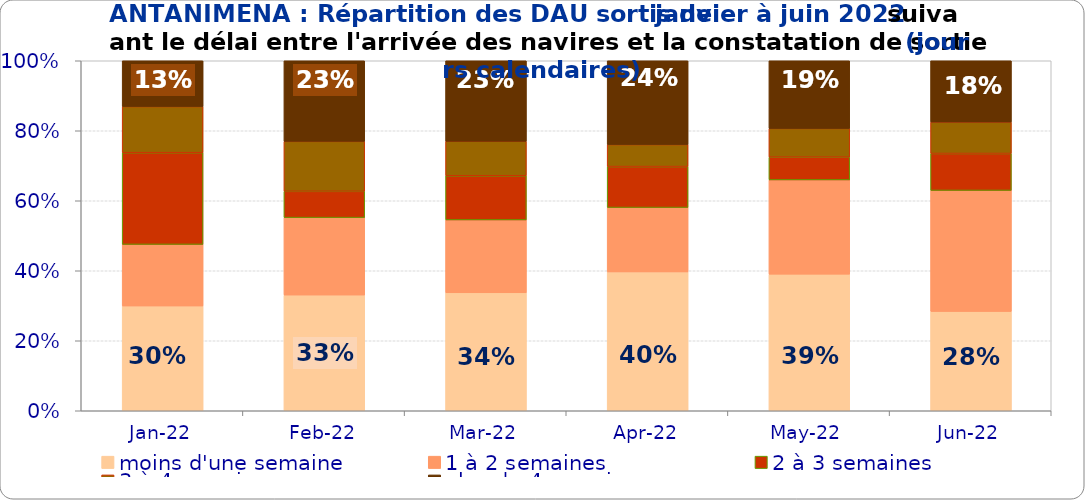
| Category | moins d'une semaine | 1 à 2 semaines | 2 à 3 semaines | 3 à 4 semaines | plus de 4 semaines |
|---|---|---|---|---|---|
| 2022-01-01 | 0.299 | 0.176 | 0.262 | 0.132 | 0.131 |
| 2022-02-01 | 0.331 | 0.221 | 0.075 | 0.143 | 0.23 |
| 2022-03-01 | 0.337 | 0.208 | 0.126 | 0.099 | 0.23 |
| 2022-04-01 | 0.397 | 0.184 | 0.117 | 0.063 | 0.239 |
| 2022-05-01 | 0.39 | 0.269 | 0.065 | 0.082 | 0.193 |
| 2022-06-01 | 0.284 | 0.346 | 0.106 | 0.09 | 0.175 |